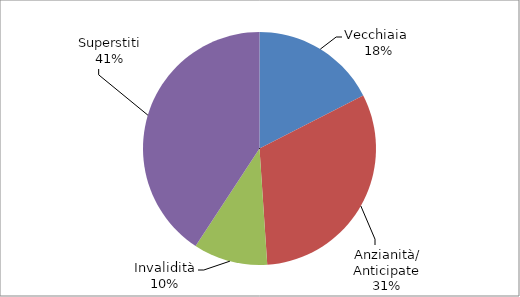
| Category | Series 0 |
|---|---|
| Vecchiaia  | 49297 |
| Anzianità/ Anticipate | 88743 |
| Invalidità | 29053 |
| Superstiti | 114961 |